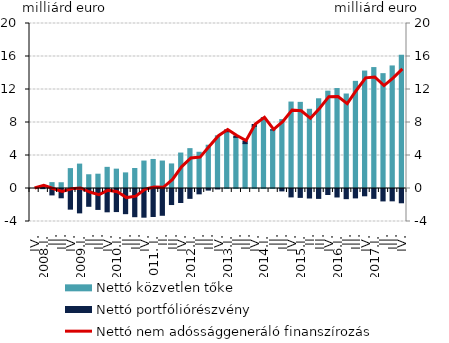
| Category | Nettó közvetlen tőke | Nettó portfóliórészvény |
|---|---|---|
| IV. | 0 | 0 |
| 2008.I. | -0.03 | 0.352 |
| II. | 0.714 | -0.777 |
| III. | 0.698 | -1.126 |
| IV. | 2.411 | -2.504 |
| 2009.I. | 2.958 | -2.955 |
| II. | 1.667 | -2.158 |
| III. | 1.734 | -2.537 |
| IV. | 2.564 | -2.826 |
| 2010.I. | 2.346 | -2.796 |
| II. | 1.892 | -3.052 |
| III. | 2.426 | -3.419 |
| IV. | 3.326 | -3.478 |
| 2011. I. | 3.52 | -3.392 |
| II. | 3.329 | -3.246 |
| III. | 2.978 | -1.944 |
| IV. | 4.298 | -1.698 |
| 2012.I. | 4.833 | -1.195 |
| II. | 4.392 | -0.648 |
| III. | 5.245 | -0.193 |
| IV. | 6.392 | -0.051 |
| 2013.I. | 6.878 | 0.215 |
| II. | 6.196 | 0.164 |
| III. | 5.441 | 0.318 |
| IV. | 7.53 | 0.23 |
| 2014.I. | 8.538 | 0.023 |
| II. | 7.091 | 0.025 |
| III. | 8.351 | -0.291 |
| IV. | 10.478 | -1.019 |
| 2015.I. | 10.442 | -1.077 |
| II. | 9.601 | -1.153 |
| III. | 10.875 | -1.2 |
| IV. | 11.799 | -0.727 |
| 2016.I. | 12.118 | -1.028 |
| II. | 11.453 | -1.233 |
| III. | 12.988 | -1.139 |
| IV. | 14.238 | -0.884 |
| 2017.I. | 14.659 | -1.197 |
| II. | 13.923 | -1.505 |
| III. | 14.856 | -1.496 |
| IV. | 16.164 | -1.732 |